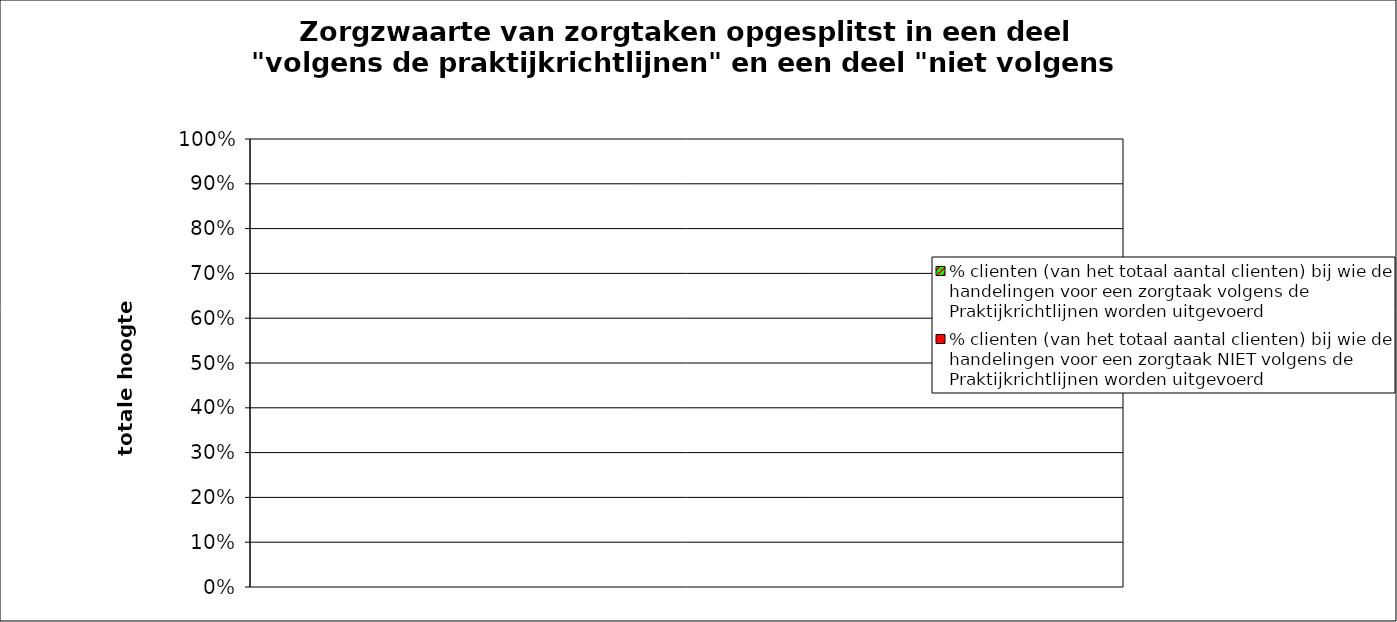
| Category | % clienten (van het totaal aantal clienten) bij wie de handelingen voor een zorgtaak NIET volgens de Praktijkrichtlijnen worden uitgevoerd | % clienten (van het totaal aantal clienten) bij wie de handelingen voor een zorgtaak volgens de Praktijkrichtlijnen worden uitgevoerd |
|---|---|---|
| 0 | 0 | 0 |
| 1 | 0 | 0 |
| 2 | 0 | 0 |
| 3 | 0 | 0 |
| 4 | 0 | 0 |
| 5 | 0 | 0 |
| 6 | 0 | 0 |
| 7 | 0 | 0 |
| 8 | 0 | 0 |
| 9 | 0 | 0 |
| 10 | 0 | 0 |